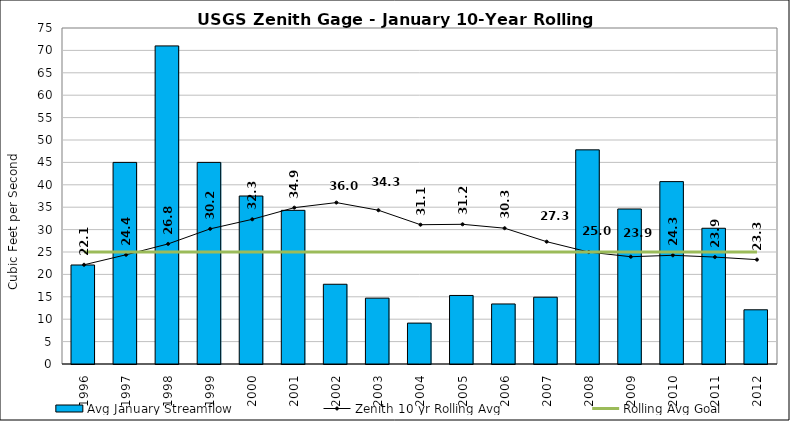
| Category | Avg January Streamflow |
|---|---|
| 1996.0 | 22.1 |
| 1997.0 | 45 |
| 1998.0 | 71 |
| 1999.0 | 45 |
| 2000.0 | 37.5 |
| 2001.0 | 34.3 |
| 2002.0 | 17.8 |
| 2003.0 | 14.7 |
| 2004.0 | 9.13 |
| 2005.0 | 15.3 |
| 2006.0 | 13.4 |
| 2007.0 | 14.91 |
| 2008.0 | 47.8 |
| 2009.0 | 34.6 |
| 2010.0 | 40.71 |
| 2011.0 | 30.3 |
| 2012.0 | 12.1 |